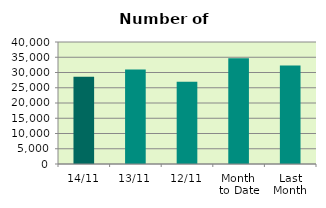
| Category | Series 0 |
|---|---|
| 14/11 | 28570 |
| 13/11 | 31018 |
| 12/11 | 27002 |
| Month 
to Date | 34635.4 |
| Last
Month | 32305.043 |